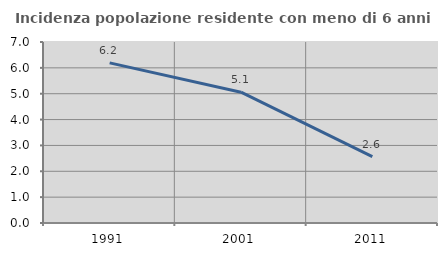
| Category | Incidenza popolazione residente con meno di 6 anni |
|---|---|
| 1991.0 | 6.192 |
| 2001.0 | 5.058 |
| 2011.0 | 2.564 |